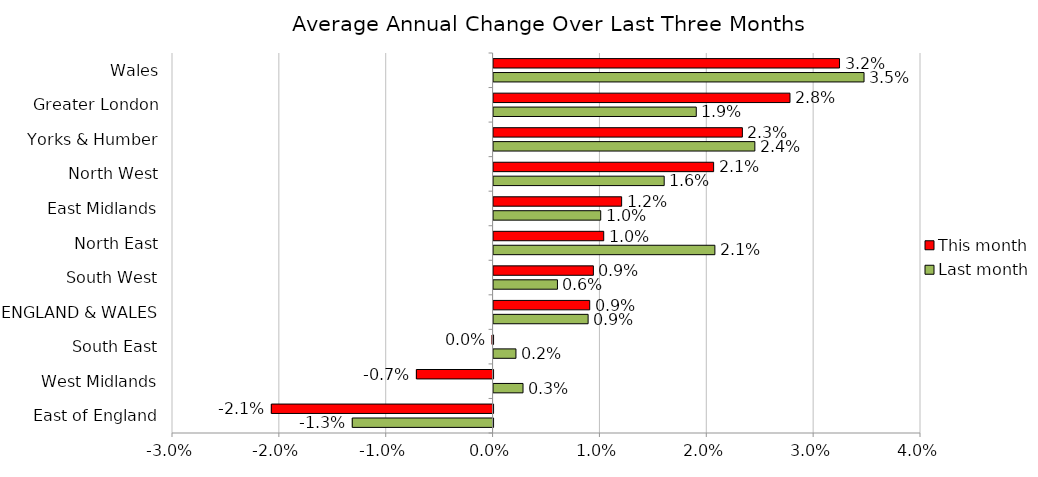
| Category | Last month | This month |
|---|---|---|
| East of England | -0.013 | -0.021 |
| West Midlands | 0.003 | -0.007 |
| South East | 0.002 | 0 |
| ENGLAND & WALES | 0.009 | 0.009 |
| South West | 0.006 | 0.009 |
| North East | 0.021 | 0.01 |
| East Midlands | 0.01 | 0.012 |
| North West | 0.016 | 0.021 |
| Yorks & Humber | 0.024 | 0.023 |
| Greater London | 0.019 | 0.028 |
| Wales | 0.035 | 0.032 |